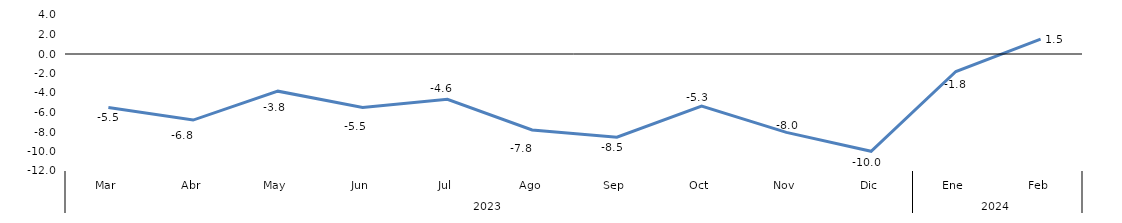
| Category | Series 0 |
|---|---|
| 0 | -5.497 |
| 1 | -6.776 |
| 2 | -3.811 |
| 3 | -5.493 |
| 4 | -4.641 |
| 5 | -7.793 |
| 6 | -8.531 |
| 7 | -5.339 |
| 8 | -8.037 |
| 9 | -9.981 |
| 10 | -1.796 |
| 11 | 1.522 |